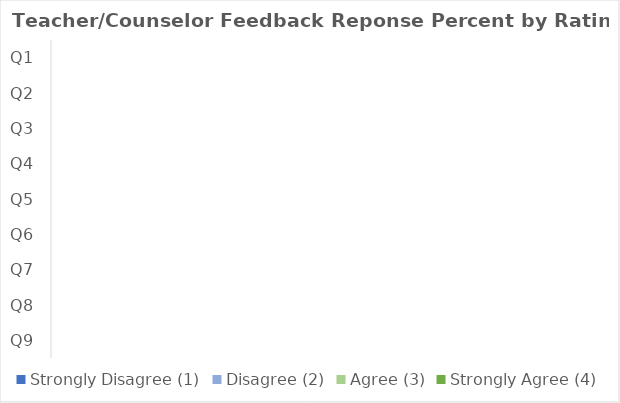
| Category | Strongly Disagree (1) | Disagree (2) | Agree (3) | Strongly Agree (4) |
|---|---|---|---|---|
| Q1 | 0 | 0 | 0 | 0 |
| Q2 | 0 | 0 | 0 | 0 |
| Q3 | 0 | 0 | 0 | 0 |
| Q4 | 0 | 0 | 0 | 0 |
| Q5 | 0 | 0 | 0 | 0 |
| Q6 | 0 | 0 | 0 | 0 |
| Q7 | 0 | 0 | 0 | 0 |
| Q8 | 0 | 0 | 0 | 0 |
| Q9 | 0 | 0 | 0 | 0 |